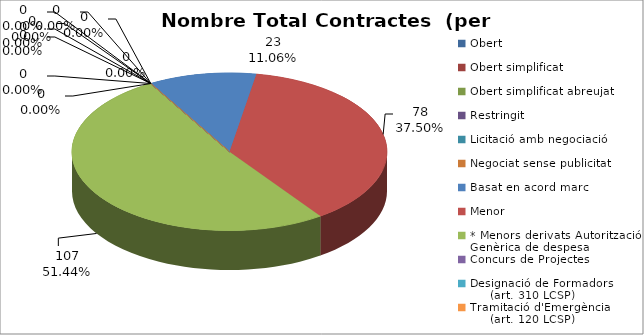
| Category | Nombre Total Contractes |
|---|---|
| Obert | 0 |
| Obert simplificat | 0 |
| Obert simplificat abreujat | 0 |
| Restringit | 0 |
| Licitació amb negociació | 0 |
| Negociat sense publicitat | 0 |
| Basat en acord marc | 23 |
| Menor | 78 |
| * Menors derivats Autorització Genèrica de despesa | 107 |
| Concurs de Projectes | 0 |
| Designació de Formadors
     (art. 310 LCSP) | 0 |
| Tramitació d'Emergència
     (art. 120 LCSP) | 0 |